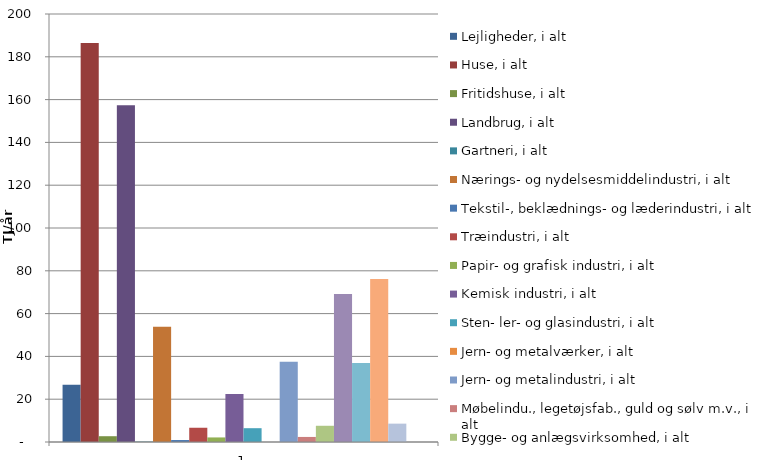
| Category | Lejligheder, i alt | Huse, i alt | Fritidshuse, i alt | Landbrug, i alt | Gartneri, i alt | Nærings- og nydelsesmiddelindustri, i alt | Tekstil-, beklædnings- og læderindustri, i alt | Træindustri, i alt | Papir- og grafisk industri, i alt | Kemisk industri, i alt | Sten- ler- og glasindustri, i alt | Jern- og metalværker, i alt | Jern- og metalindustri, i alt | Møbelindu., legetøjsfab., guld og sølv m.v., i alt | Bygge- og anlægsvirksomhed, i alt | Detail- og engroshandel, i alt | Service- og forlystelsesvirksomhed, i alt | Offentlige foretageneder, i alt | Gade- og vejbelysning, i alt | Elektriske baner, i alt |
|---|---|---|---|---|---|---|---|---|---|---|---|---|---|---|---|---|---|---|---|---|
| 0 | 26.732 | 186.495 | 2.706 | 157.416 | 0.159 | 53.864 | 0.919 | 6.661 | 2.133 | 22.438 | 6.451 | 0 | 37.449 | 2.364 | 7.582 | 69.182 | 36.908 | 76.206 | 8.576 | 0 |